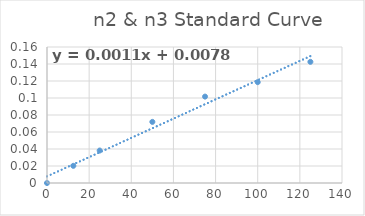
| Category | Series 0 |
|---|---|
| 0.0 | 0 |
| 12.5 | 0.02 |
| 25.0 | 0.038 |
| 50.0 | 0.072 |
| 75.0 | 0.102 |
| 100.0 | 0.119 |
| 125.0 | 0.143 |